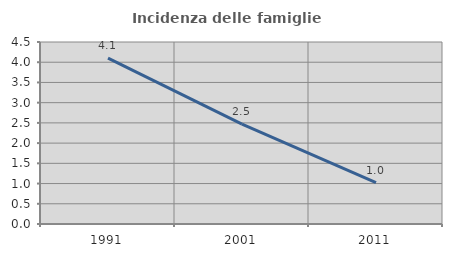
| Category | Incidenza delle famiglie numerose |
|---|---|
| 1991.0 | 4.1 |
| 2001.0 | 2.472 |
| 2011.0 | 1.022 |